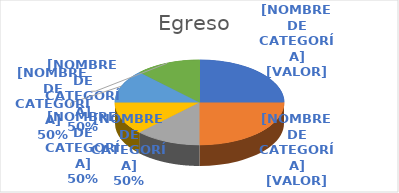
| Category | Series 0 |
|---|---|
| Julio  | 1 |
| Agosto  | 1 |
| Septiembre | 0.5 |
| Octubre | 0.5 |
| Noviembre | 0.5 |
| Diciembre | 0.5 |